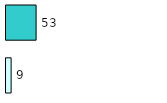
| Category | Series 0 | Series 1 |
|---|---|---|
| 0 | 9 | 53 |